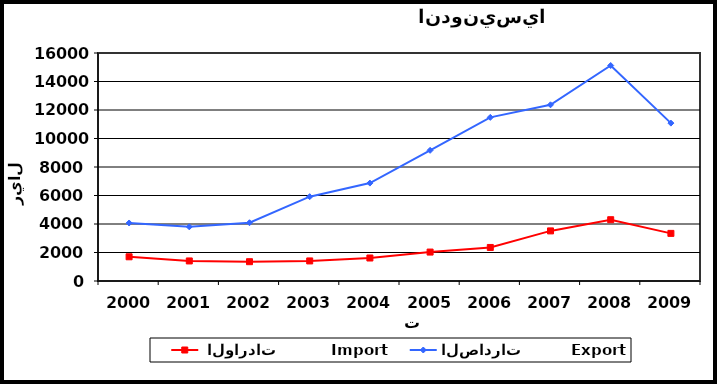
| Category |  الواردات           Import | الصادرات          Export |
|---|---|---|
| 2000.0 | 1699 | 4071 |
| 2001.0 | 1407 | 3802 |
| 2002.0 | 1355 | 4088 |
| 2003.0 | 1408 | 5917 |
| 2004.0 | 1614 | 6871 |
| 2005.0 | 2030 | 9170 |
| 2006.0 | 2354 | 11484 |
| 2007.0 | 3516 | 12366 |
| 2008.0 | 4301 | 15122 |
| 2009.0 | 3342 | 11079 |